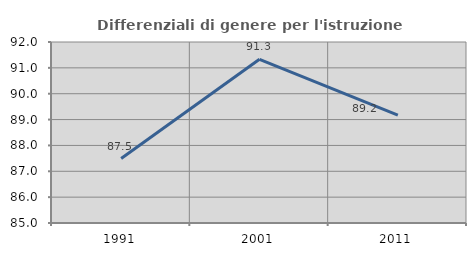
| Category | Differenziali di genere per l'istruzione superiore |
|---|---|
| 1991.0 | 87.492 |
| 2001.0 | 91.332 |
| 2011.0 | 89.168 |